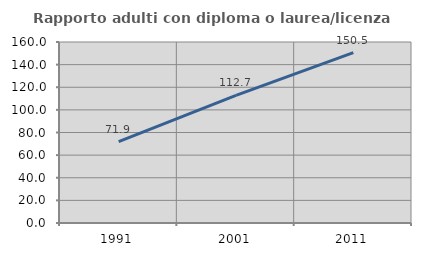
| Category | Rapporto adulti con diploma o laurea/licenza media  |
|---|---|
| 1991.0 | 71.936 |
| 2001.0 | 112.738 |
| 2011.0 | 150.538 |